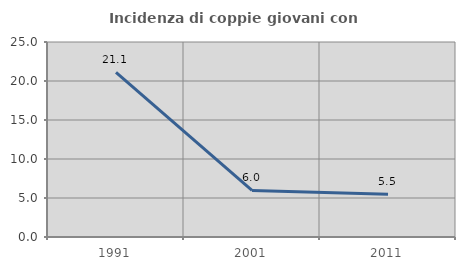
| Category | Incidenza di coppie giovani con figli |
|---|---|
| 1991.0 | 21.094 |
| 2001.0 | 5.97 |
| 2011.0 | 5.479 |